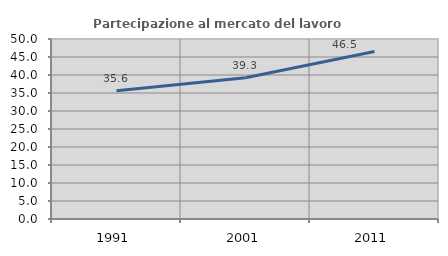
| Category | Partecipazione al mercato del lavoro  femminile |
|---|---|
| 1991.0 | 35.618 |
| 2001.0 | 39.258 |
| 2011.0 | 46.527 |